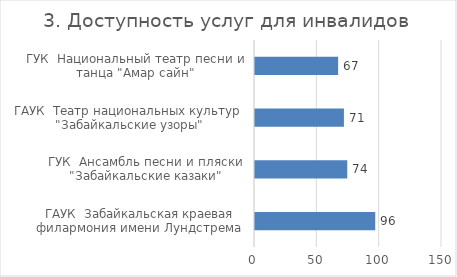
| Category | 3. Доступность услуг для инвалидов |
|---|---|
| ГАУК  Забайкальская краевая филармония имени Лундстрема  | 96.441 |
| ГУК  Ансамбль песни и пляски  "Забайкальские казаки" | 74 |
| ГАУК  Театр национальных культур  "Забайкальские узоры" | 71.333 |
| ГУК  Национальный театр песни и танца "Амар сайн" | 66.677 |